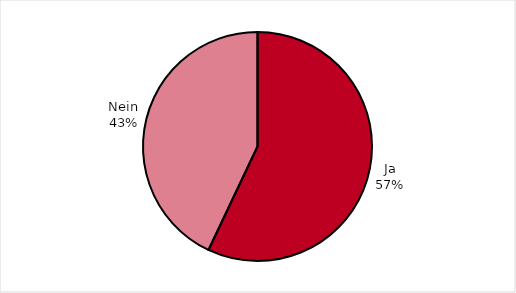
| Category | Series 0 |
|---|---|
| Ja | 57.045 |
| Nein | 42.955 |